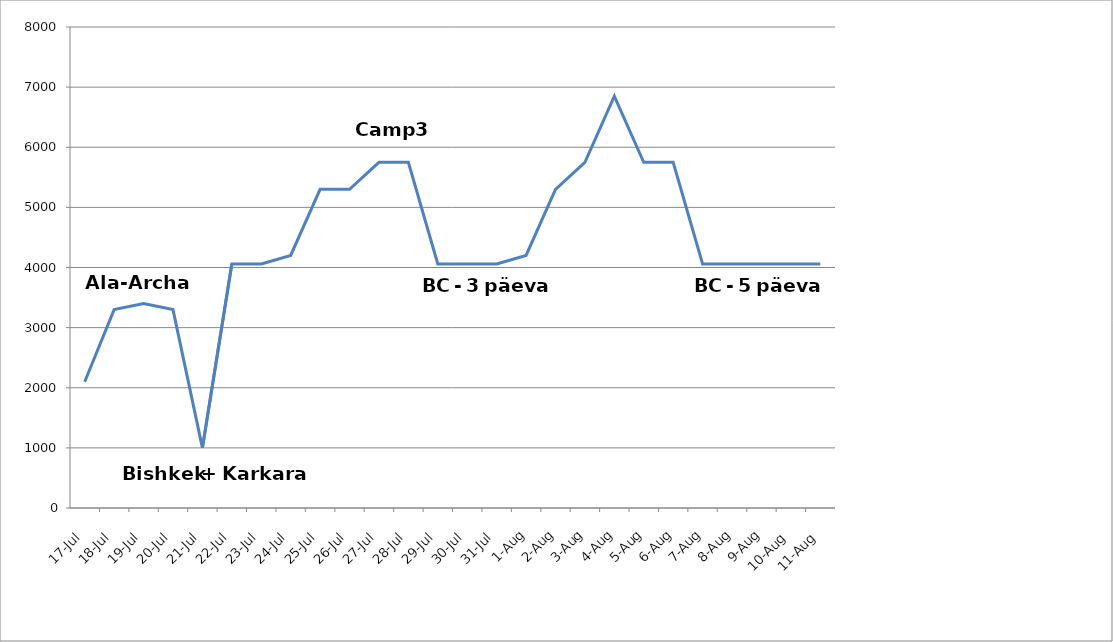
| Category | Series 0 |
|---|---|
| 2018-07-17 | 2100 |
| 2018-07-18 | 3300 |
| 2018-07-19 | 3400 |
| 2018-07-20 | 3300 |
| 2018-07-21 | 1000 |
| 2018-07-22 | 4060 |
| 2018-07-23 | 4060 |
| 2018-07-24 | 4200 |
| 2018-07-25 | 5300 |
| 2018-07-26 | 5300 |
| 2018-07-27 | 5750 |
| 2018-07-28 | 5750 |
| 2018-07-29 | 4060 |
| 2018-07-30 | 4060 |
| 2018-07-31 | 4060 |
| 2018-08-01 | 4200 |
| 2018-08-02 | 5300 |
| 2018-08-03 | 5750 |
| 2018-08-04 | 6850 |
| 2018-08-05 | 5750 |
| 2018-08-06 | 5750 |
| 2018-08-07 | 4060 |
| 2018-08-08 | 4060 |
| 2018-08-09 | 4060 |
| 2018-08-10 | 4060 |
| 2018-08-11 | 4060 |